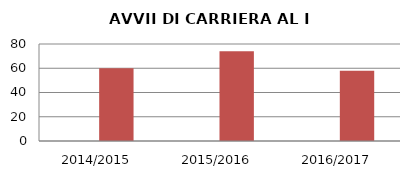
| Category | ANNO | NUMERO |
|---|---|---|
| 2014/2015 | 0 | 60 |
| 2015/2016 | 0 | 74 |
| 2016/2017 | 0 | 58 |